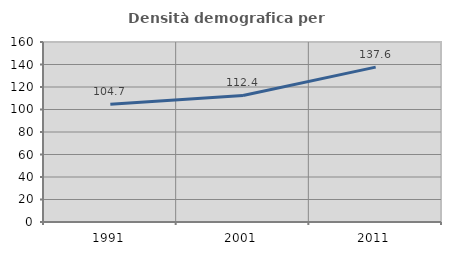
| Category | Densità demografica |
|---|---|
| 1991.0 | 104.676 |
| 2001.0 | 112.447 |
| 2011.0 | 137.645 |